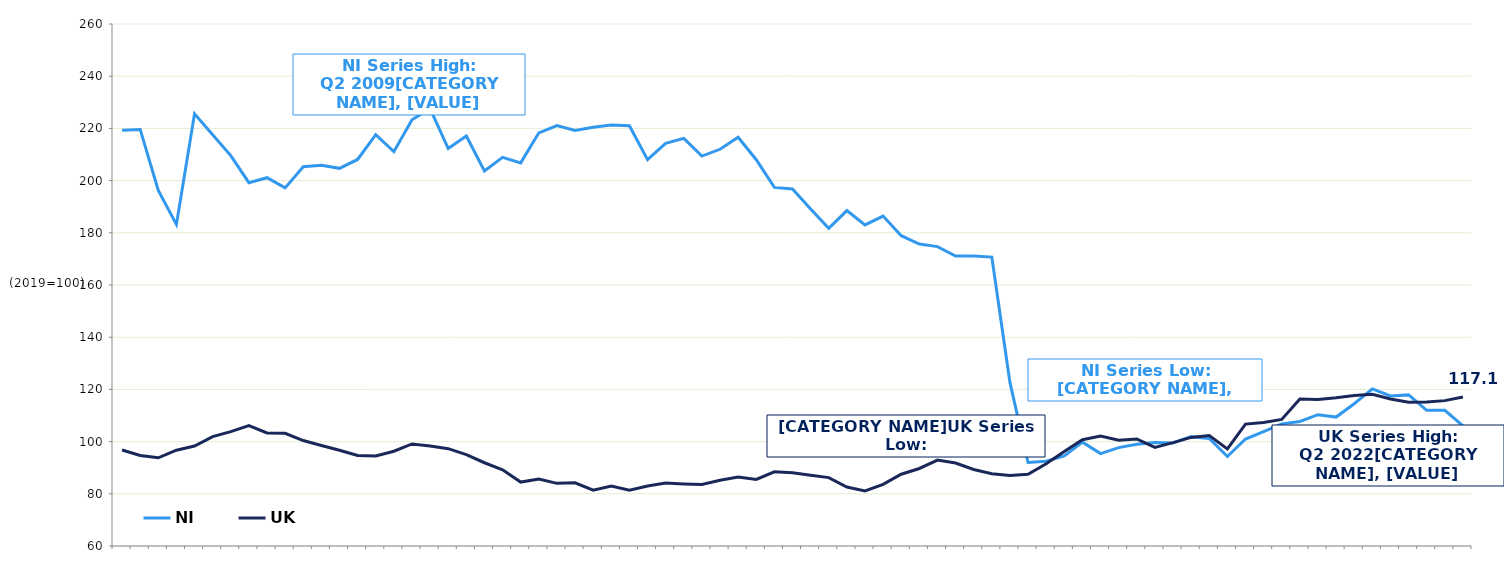
| Category | NI | UK  |
|---|---|---|
|  | 219.3 | 96.8 |
|  | 219.6 | 94.7 |
| Q3 2005 | 196.2 | 93.8 |
|  | 183.2 | 96.7 |
|  | 225.6 | 98.3 |
|  | 217.6 | 101.9 |
| Q3 2006 | 209.6 | 103.8 |
|  | 199.2 | 106.1 |
|  | 201.1 | 103.3 |
|  | 197.2 | 103.2 |
| Q3 2007 | 205.3 | 100.4 |
|  | 205.9 | 98.5 |
|  | 204.7 | 96.7 |
|  | 208.1 | 94.7 |
| Q3 2008 | 217.6 | 94.5 |
|  | 211.1 | 96.3 |
|  | 223.3 | 99.1 |
|  | 227.6 | 98.3 |
| Q3 2009 | 212.3 | 97.3 |
|  | 217.1 | 95 |
|  | 203.7 | 91.9 |
|  | 208.9 | 89.2 |
| Q3 2010 | 206.8 | 84.5 |
|  | 218.3 | 85.7 |
|  | 221.1 | 84 |
|  | 219.2 | 84.2 |
| Q3 2011 | 220.4 | 81.4 |
|  | 221.3 | 83 |
|  | 221 | 81.4 |
|  | 208 | 83 |
| Q3 2012 | 214.3 | 84.1 |
|  | 216.2 | 83.8 |
|  | 209.4 | 83.6 |
|  | 212 | 85.2 |
| Q3 2013 | 216.6 | 86.4 |
|  | 208 | 85.5 |
|  | 197.4 | 88.4 |
|  | 196.8 | 88.1 |
| Q3 2014 | 189.1 | 87.1 |
|  | 181.7 | 86.2 |
|  | 188.5 | 82.6 |
|  | 183 | 81.1 |
| Q3 2015 | 186.4 | 83.6 |
|  | 178.9 | 87.5 |
|  | 175.7 | 89.7 |
|  | 174.7 | 92.9 |
| Q3 2016 | 171.1 | 91.8 |
|  | 171.1 | 89.3 |
|  | 170.7 | 87.7 |
|  | 122.7 | 87 |
| Q3 2017 | 92 | 87.5 |
|  | 92.5 | 91.5 |
|  | 94.5 | 96.2 |
|  | 99.8 | 100.7 |
| Q3 2018 | 95.4 | 102.1 |
|  | 97.7 | 100.5 |
|  | 99 | 101 |
|  | 99.7 | 97.8 |
| Q3 2019 | 99.5 | 99.6 |
|  | 101.9 | 101.6 |
|  | 101.2 | 102.3 |
|  | 94.3 | 97.2 |
| Q3 2020 | 101 | 106.7 |
|  | 103.8 | 107.3 |
|  | 106.8 | 108.5 |
|  | 107.7 | 116.3 |
| Q3 2021 | 110.3 | 116.1 |
|  | 109.4 | 116.8 |
|  | 114.5 | 117.7 |
|  | 120.2 | 118.1 |
| Q3 2022 | 117.5 | 116.3 |
|  | 117.9 | 115.1 |
|  | 112 | 115.2 |
|  | 112 | 115.7 |
| Q3 2023 | 106 | 117.1 |